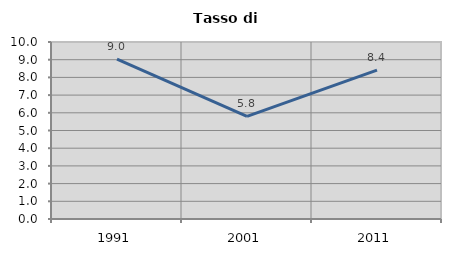
| Category | Tasso di disoccupazione   |
|---|---|
| 1991.0 | 9.031 |
| 2001.0 | 5.797 |
| 2011.0 | 8.413 |